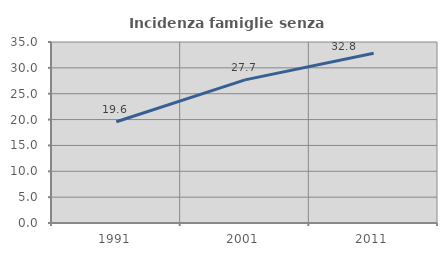
| Category | Incidenza famiglie senza nuclei |
|---|---|
| 1991.0 | 19.586 |
| 2001.0 | 27.681 |
| 2011.0 | 32.828 |